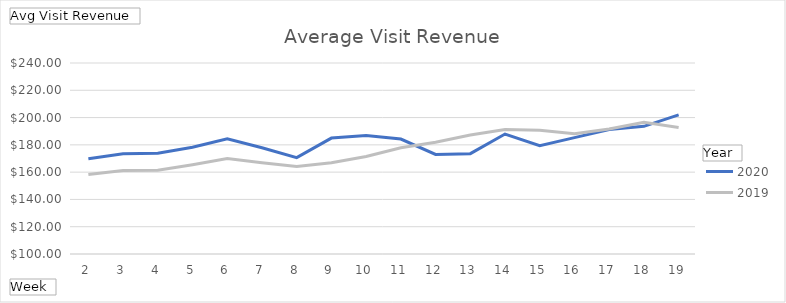
| Category | 2020 | 2019 |
|---|---|---|
| 2 | 169.787 | 158.293 |
| 3 | 173.497 | 161.121 |
| 4 | 173.916 | 161.327 |
| 5 | 178.187 | 165.484 |
| 6 | 184.479 | 169.976 |
| 7 | 177.885 | 166.808 |
| 8 | 170.654 | 164.057 |
| 9 | 184.961 | 166.94 |
| 10 | 186.853 | 171.458 |
| 11 | 184.278 | 177.884 |
| 12 | 173 | 181.916 |
| 13 | 173.533 | 187.156 |
| 14 | 187.915 | 191.262 |
| 15 | 179.448 | 190.745 |
| 16 | 185.284 | 188.118 |
| 17 | 191.202 | 191.587 |
| 18 | 193.572 | 196.506 |
| 19 | 201.998 | 192.715 |